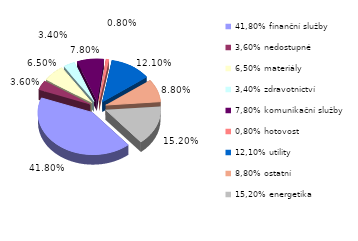
| Category | Series 0 |
|---|---|
| 41,80% finanční služby | 0.418 |
| 3,60% nedostupné | 0.036 |
| 6,50% materiály | 0.065 |
| 3,40% zdravotnictví | 0.034 |
| 7,80% komunikační služby | 0.078 |
| 0,80% hotovost | 0.008 |
| 12,10% utility | 0.121 |
| 8,80% ostatní | 0.088 |
| 15,20% energetika | 0.152 |